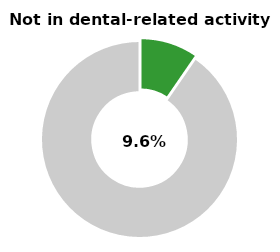
| Category | Series 0 |
|---|---|
| Not in dental-related activity | 0.096 |
| Other | 0.904 |